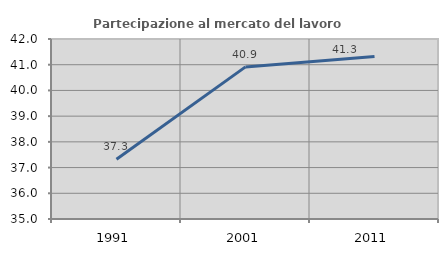
| Category | Partecipazione al mercato del lavoro  femminile |
|---|---|
| 1991.0 | 37.323 |
| 2001.0 | 40.915 |
| 2011.0 | 41.322 |